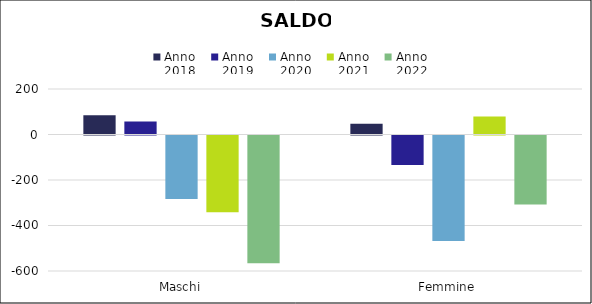
| Category | Anno
2018 | Anno
2019 | Anno
2020 | Anno
2021 | Anno
2022 |
|---|---|---|---|---|---|
| Maschi | 85 | 57 | -279 | -337 | -561 |
| Femmine | 47 | -130 | -464 | 79 | -303 |